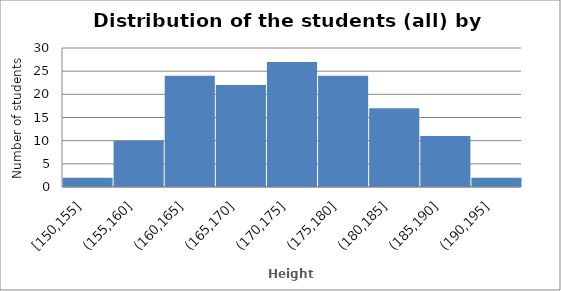
| Category | Series 0 |
|---|---|
| 152.5 | 0.038 |
| 157.5 | 0.17 |
| 162.5 | 0.396 |
| 167.5 | 0.208 |
| 172.5 | 0.151 |
| 177.5 | 0 |
| 182.5 | 0.019 |
| 187.5 | 0.019 |
| 192.5 | 0 |